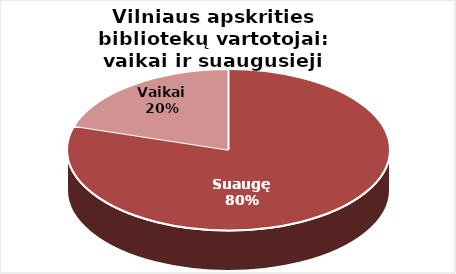
| Category | Series 0 |
|---|---|
| Suaugę | 55360 |
| Vaikai | 14068 |